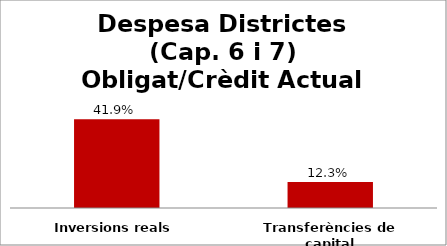
| Category | Series 0 |
|---|---|
| Inversions reals | 0.419 |
| Transferències de capital | 0.123 |